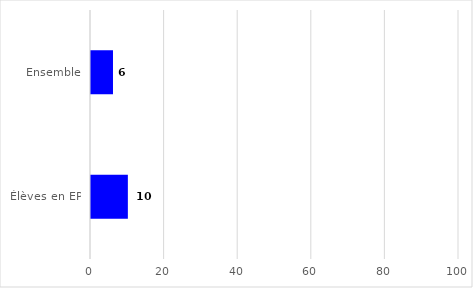
| Category | Series 0 |
|---|---|
| Ensemble | 5.975 |
| Élèves en EP | 10.017 |